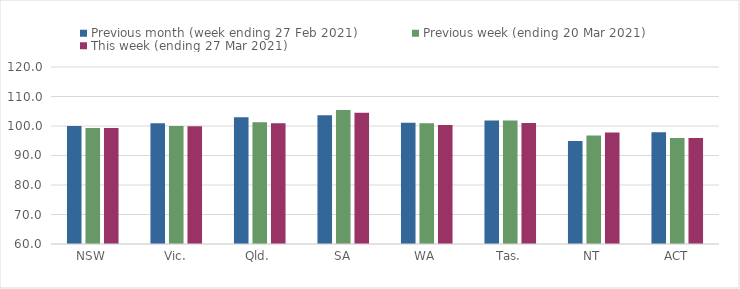
| Category | Previous month (week ending 27 Feb 2021) | Previous week (ending 20 Mar 2021) | This week (ending 27 Mar 2021) |
|---|---|---|---|
| NSW | 100.02 | 99.31 | 99.31 |
| Vic. | 100.92 | 100 | 99.89 |
| Qld. | 102.94 | 101.28 | 100.91 |
| SA | 103.63 | 105.4 | 104.47 |
| WA | 101.14 | 100.9 | 100.32 |
| Tas. | 101.9 | 101.9 | 101 |
| NT | 94.9 | 96.8 | 97.77 |
| ACT | 97.88 | 95.91 | 95.94 |